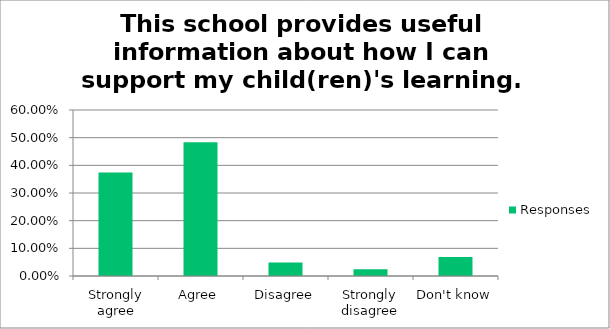
| Category | Responses |
|---|---|
| Strongly agree | 0.374 |
| Agree | 0.484 |
| Disagree | 0.049 |
| Strongly disagree | 0.024 |
| Don't know | 0.069 |